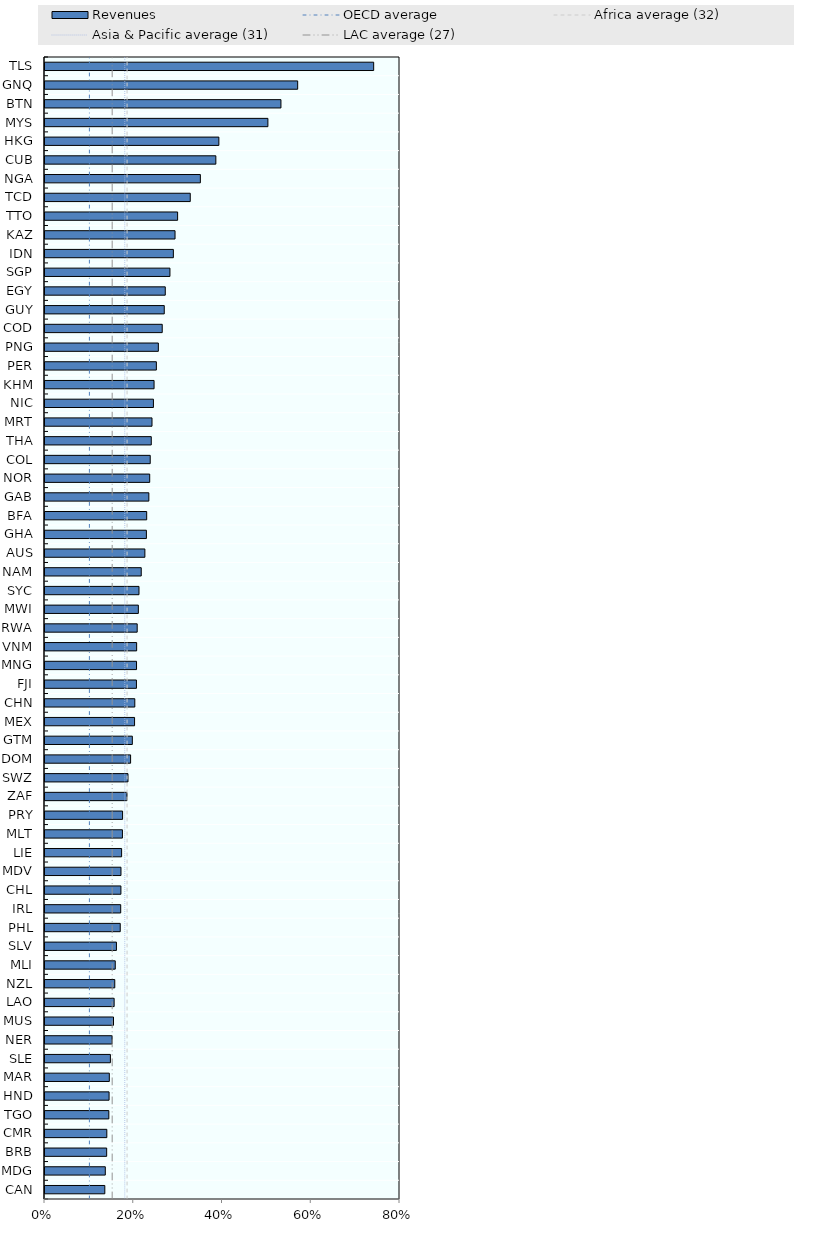
| Category | Revenues |
|---|---|
| CAN | 0.135 |
| MDG | 0.136 |
| BRB | 0.139 |
| CMR | 0.139 |
| TGO | 0.144 |
| HND | 0.144 |
| MAR | 0.145 |
| SLE | 0.147 |
| NER | 0.151 |
| MUS | 0.154 |
| LAO | 0.156 |
| NZL | 0.157 |
| MLI | 0.158 |
| SLV | 0.161 |
| PHL | 0.17 |
| IRL | 0.171 |
| CHL | 0.171 |
| MDV | 0.171 |
| LIE | 0.173 |
| MLT | 0.174 |
| PRY | 0.175 |
| ZAF | 0.185 |
| SWZ | 0.187 |
| DOM | 0.193 |
| GTM | 0.197 |
| MEX | 0.202 |
| CHN | 0.202 |
| FJI | 0.206 |
| MNG | 0.206 |
| VNM | 0.207 |
| RWA | 0.208 |
| MWI | 0.21 |
| SYC | 0.212 |
| NAM | 0.217 |
| AUS | 0.225 |
| GHA | 0.228 |
| BFA | 0.229 |
| GAB | 0.234 |
| NOR | 0.236 |
| COL | 0.237 |
| THA | 0.24 |
| MRT | 0.241 |
| NIC | 0.244 |
| KHM | 0.246 |
| PER | 0.251 |
| PNG | 0.255 |
| COD | 0.264 |
| GUY | 0.269 |
| EGY | 0.271 |
| SGP | 0.282 |
| IDN | 0.289 |
| KAZ | 0.293 |
| TTO | 0.299 |
| TCD | 0.327 |
| NGA | 0.35 |
| CUB | 0.385 |
| HKG | 0.392 |
| MYS | 0.502 |
| BTN | 0.532 |
| GNQ | 0.569 |
| TLS | 0.741 |